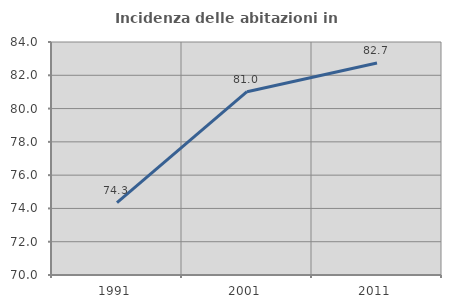
| Category | Incidenza delle abitazioni in proprietà  |
|---|---|
| 1991.0 | 74.349 |
| 2001.0 | 81.012 |
| 2011.0 | 82.742 |